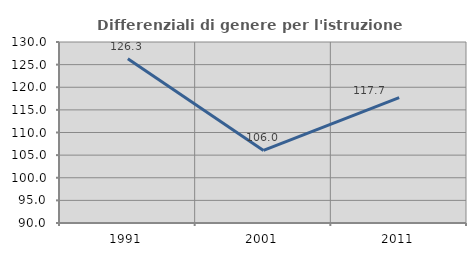
| Category | Differenziali di genere per l'istruzione superiore |
|---|---|
| 1991.0 | 126.307 |
| 2001.0 | 106.03 |
| 2011.0 | 117.713 |